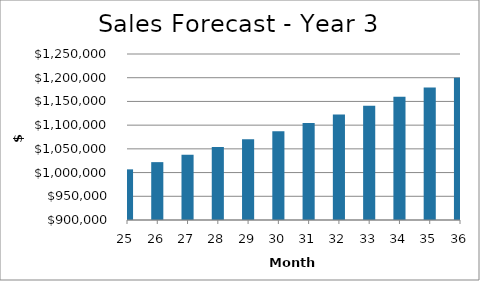
| Category | Year 3 |
|---|---|
| 25.0 | 1006772.794 |
| 26.0 | 1022001.311 |
| 27.0 | 1037633.449 |
| 28.0 | 1053687.299 |
| 29.0 | 1070181.969 |
| 30.0 | 1087137.645 |
| 31.0 | 1104575.656 |
| 32.0 | 1122518.542 |
| 33.0 | 1140990.128 |
| 34.0 | 1160015.6 |
| 35.0 | 1179621.591 |
| 36.0 | 1199836.265 |